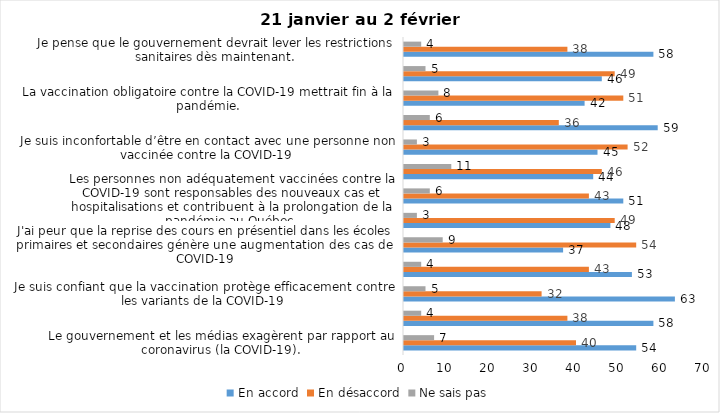
| Category | En accord | En désaccord | Ne sais pas |
|---|---|---|---|
| Le gouvernement et les médias exagèrent par rapport au coronavirus (la COVID-19). | 54 | 40 | 7 |
| J’ai peur que le système de santé soit débordé par les cas de COVID-19. | 58 | 38 | 4 |
| Je suis confiant que la vaccination protège efficacement contre les variants de la COVID-19 | 63 | 32 | 5 |
| Je suis favorable à ce que le port du masque ne soit plus obligatoire au Québec. | 53 | 43 | 4 |
| J'ai peur que la reprise des cours en présentiel dans les écoles primaires et secondaires génère une augmentation des cas de COVID-19 | 37 | 54 | 9 |
| Je crois que le passeport vaccinal devrait être requis pour davantage de services et commerces (ex. : spas, centre d’achats, centre de soins personnels. | 48 | 49 | 3 |
| Les personnes non adéquatement vaccinées contre la COVID-19 sont responsables des nouveaux cas et hospitalisations et contribuent à la prolongation de la pandémie au Québec. | 51 | 43 | 6 |
| La pandémie ne sera pas terminée au Québec avant que tous les habitants de la terre puissent être vaccinés contre la COVID-19.   | 44 | 46 | 11 |
| Je suis inconfortable d’être en contact avec une personne non vaccinée contre la COVID-19 | 45 | 52 | 3 |
| Je n'ai pas peur du variant Omicron, car il semble moins dangereux pour la santé. | 59 | 36 | 6 |
| La vaccination obligatoire contre la COVID-19 mettrait fin à la pandémie. | 42 | 51 | 8 |
| Je suis favorable à ce que les personnes non vaccinées paient une taxe supplémentaire (contribution santé). | 46 | 49 | 5 |
| Je pense que le gouvernement devrait lever les restrictions sanitaires dès maintenant. | 58 | 38 | 4 |